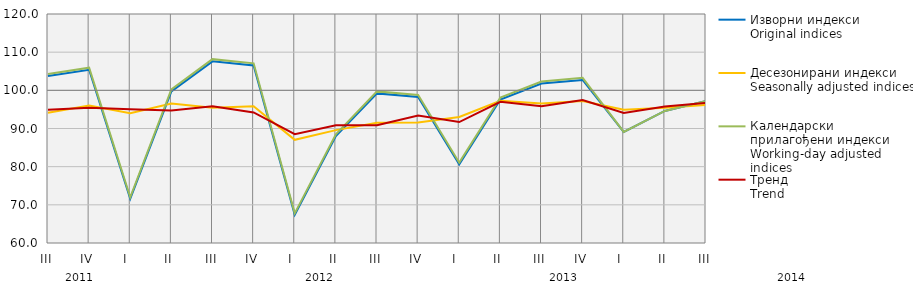
| Category | Изворни индекси
Original indices | Десезонирани индекси
Seasonally adjusted indices | Календарски прилагођени индекси
Working-day adjusted indices | Тренд
Trend |
|---|---|---|---|---|
| III | 103.754 | 94.132 | 104.302 | 94.93 |
| IV | 105.376 | 96.05 | 105.939 | 95.405 |
| I  | 71.601 | 93.973 | 71.98 | 95.035 |
| II | 99.705 | 96.553 | 100.233 | 94.687 |
| III | 107.6 | 95.44 | 108.174 | 95.84 |
| IV | 106.508 | 95.814 | 107.07 | 94.216 |
| I  | 67.411 | 87.037 | 67.77 | 88.505 |
| II | 88.026 | 89.571 | 88.493 | 90.874 |
| III | 99.2 | 91.479 | 99.724 | 90.848 |
| IV | 98.255 | 91.562 | 98.774 | 93.417 |
| I  | 80.624 | 93.031 | 81.053 | 91.682 |
| II | 97.612 | 97.27 | 98.129 | 97.008 |
| III | 101.777 | 96.533 | 102.315 | 95.821 |
| IV | 102.721 | 97.224 | 103.264 | 97.441 |
| I  | 89.092 | 94.913 | 89.094 | 94.05 |
| II | 94.609 | 95.455 | 94.609 | 95.762 |
| III | 97.218 | 96.189 | 97.217 | 96.726 |